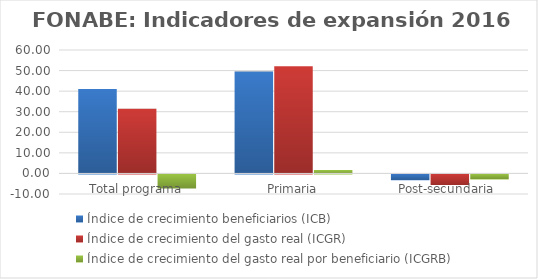
| Category | Índice de crecimiento beneficiarios (ICB)  | Índice de crecimiento del gasto real (ICGR)  | Índice de crecimiento del gasto real por beneficiario (ICGRB)  |
|---|---|---|---|
| Total programa | 41.083 | 31.395 | -6.867 |
| Primaria | 49.545 | 52.082 | 1.696 |
| Post-secundaria  | -2.859 | -5.196 | -2.405 |